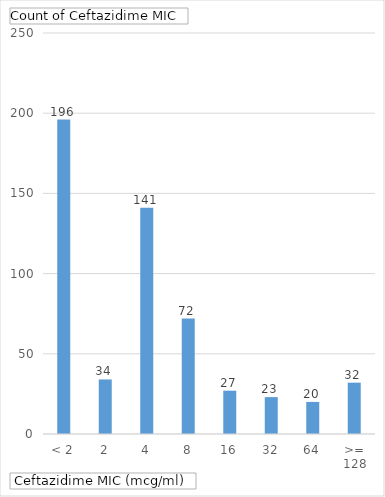
| Category | Total |
|---|---|
| < 2 | 196 |
| 2 | 34 |
| 4 | 141 |
| 8 | 72 |
| 16 | 27 |
| 32 | 23 |
| 64 | 20 |
| >= 128 | 32 |